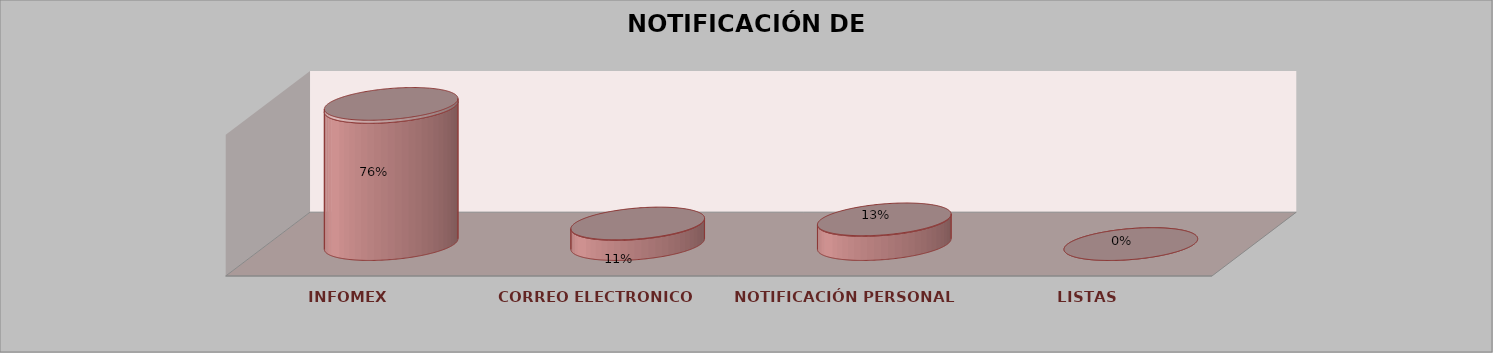
| Category | Series 0 | Series 1 | Series 2 | Series 3 | Series 4 |
|---|---|---|---|---|---|
| INFOMEX |  |  |  | 34 | 0.756 |
| CORREO ELECTRONICO |  |  |  | 5 | 0.111 |
| NOTIFICACIÓN PERSONAL |  |  |  | 6 | 0.133 |
| LISTAS |  |  |  | 0 | 0 |